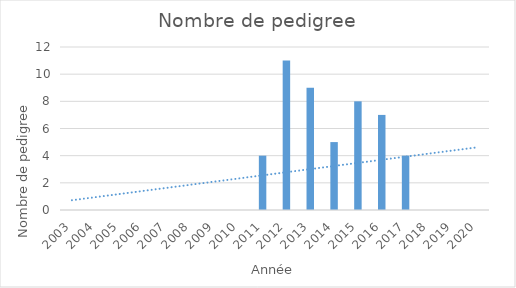
| Category | Series 0 |
|---|---|
| 2003.0 | 0 |
| 2004.0 | 0 |
| 2005.0 | 0 |
| 2006.0 | 0 |
| 2007.0 | 0 |
| 2008.0 | 0 |
| 2009.0 | 0 |
| 2010.0 | 0 |
| 2011.0 | 4 |
| 2012.0 | 11 |
| 2013.0 | 9 |
| 2014.0 | 5 |
| 2015.0 | 8 |
| 2016.0 | 7 |
| 2017.0 | 4 |
| 2018.0 | 0 |
| 2019.0 | 0 |
| 2020.0 | 0 |